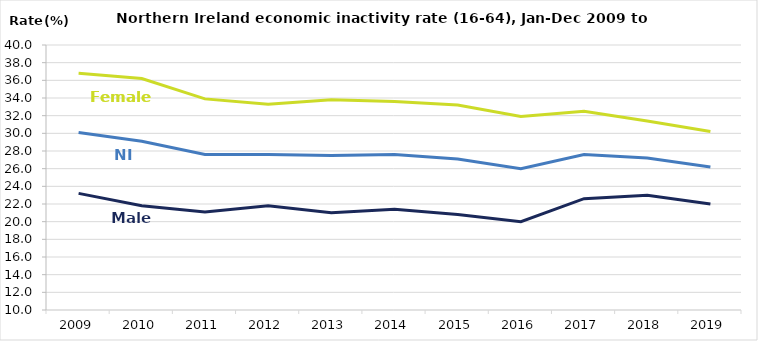
| Category | Male | Female | Total |
|---|---|---|---|
| 2009.0 | 23.2 | 36.8 | 30.1 |
| 2010.0 | 21.8 | 36.2 | 29.1 |
| 2011.0 | 21.1 | 33.9 | 27.6 |
| 2012.0 | 21.8 | 33.3 | 27.6 |
| 2013.0 | 21 | 33.8 | 27.5 |
| 2014.0 | 21.4 | 33.6 | 27.6 |
| 2015.0 | 20.8 | 33.2 | 27.1 |
| 2016.0 | 20 | 31.9 | 26 |
| 2017.0 | 22.6 | 32.5 | 27.6 |
| 2018.0 | 23 | 31.4 | 27.2 |
| 2019.0 | 22 | 30.2 | 26.2 |